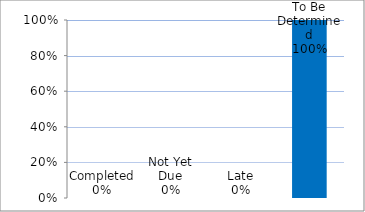
| Category | Series 0 |
|---|---|
| Completed | 0 |
| Not Yet Due | 0 |
| Late | 0 |
| To Be Determined | 1 |